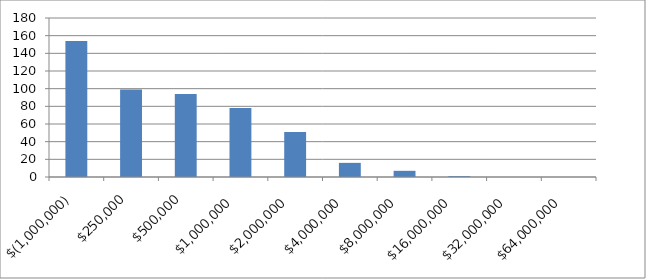
| Category | Series 0 |
|---|---|
| -1000000.0 | 154 |
| 250000.0 | 99 |
| 500000.0 | 94 |
| 1000000.0 | 78 |
| 2000000.0 | 51 |
| 4000000.0 | 16 |
| 8000000.0 | 7 |
| 16000000.0 | 1 |
| 32000000.0 | 0 |
| 64000000.0 | 0 |